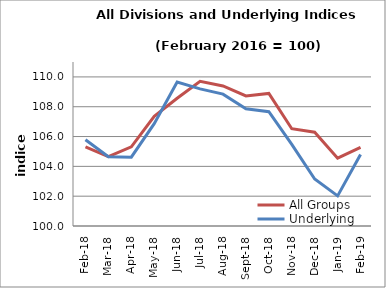
| Category | All Groups | Underlying |
|---|---|---|
| 2018-02-01 | 105.308 | 105.79 |
| 2018-03-01 | 104.655 | 104.651 |
| 2018-04-01 | 105.309 | 104.614 |
| 2018-05-01 | 107.355 | 106.863 |
| 2018-06-01 | 108.567 | 109.659 |
| 2018-07-01 | 109.702 | 109.198 |
| 2018-08-01 | 109.392 | 108.845 |
| 2018-09-01 | 108.722 | 107.857 |
| 2018-10-01 | 108.895 | 107.664 |
| 2018-11-01 | 106.524 | 105.471 |
| 2018-12-01 | 106.292 | 103.148 |
| 2019-01-01 | 104.55 | 102.019 |
| 2019-02-01 | 105.272 | 104.794 |